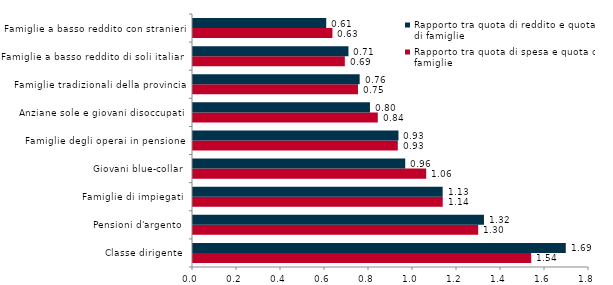
| Category | Rapporto tra quota di spesa e quota di famiglie | Rapporto tra quota di reddito e quota di famiglie |
|---|---|---|
| Classe dirigente | 1.537 | 1.694 |
| Pensioni d'argento | 1.296 | 1.323 |
| Famiglie di impiegati | 1.135 | 1.135 |
| Giovani blue-collar | 1.06 | 0.965 |
| Famiglie degli operai in pensione | 0.931 | 0.934 |
| Anziane sole e giovani disoccupati | 0.84 | 0.804 |
| Famiglie tradizionali della provincia | 0.75 | 0.758 |
| Famiglie a basso reddito di soli italiani | 0.69 | 0.707 |
| Famiglie a basso reddito con stranieri | 0.634 | 0.606 |